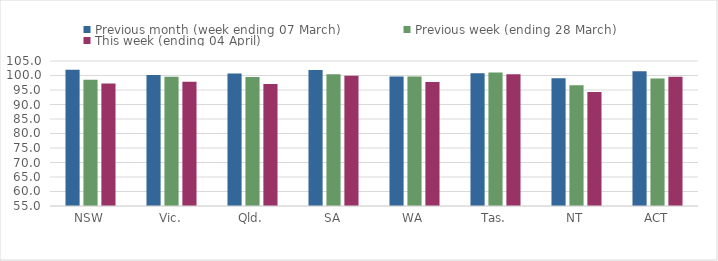
| Category | Previous month (week ending 07 March) | Previous week (ending 28 March) | This week (ending 04 April) |
|---|---|---|---|
| NSW | 101.994 | 98.527 | 97.271 |
| Vic. | 100.205 | 99.533 | 97.805 |
| Qld. | 100.715 | 99.496 | 97.098 |
| SA | 101.88 | 100.424 | 99.888 |
| WA | 99.689 | 99.669 | 97.793 |
| Tas. | 100.786 | 101.059 | 100.433 |
| NT | 99.075 | 96.633 | 94.303 |
| ACT | 101.455 | 98.969 | 99.576 |